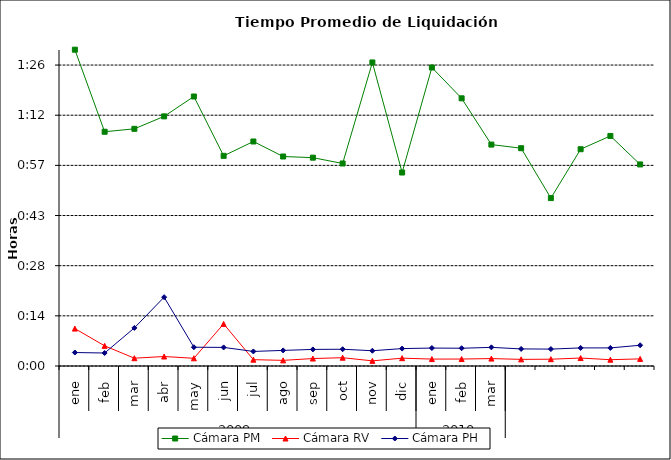
| Category | Cámara PM | Cámara RV | Cámara PH |
|---|---|---|---|
| 0 | 0.063 | 0.007 | 0.003 |
| 1 | 0.047 | 0.004 | 0.003 |
| 2 | 0.047 | 0.002 | 0.008 |
| 3 | 0.05 | 0.002 | 0.014 |
| 4 | 0.054 | 0.002 | 0.004 |
| 5 | 0.042 | 0.008 | 0.004 |
| 6 | 0.045 | 0.001 | 0.003 |
| 7 | 0.042 | 0.001 | 0.003 |
| 8 | 0.042 | 0.001 | 0.003 |
| 9 | 0.04 | 0.002 | 0.003 |
| 10 | 0.061 | 0.001 | 0.003 |
| 11 | 0.039 | 0.002 | 0.003 |
| 12 | 0.06 | 0.001 | 0.004 |
| 13 | 0.053 | 0.001 | 0.004 |
| 14 | 0.044 | 0.001 | 0.004 |
| 15 | 0.043 | 0.001 | 0.003 |
| 16 | 0.033 | 0.001 | 0.003 |
| 17 | 0.043 | 0.002 | 0.004 |
| 18 | 0.046 | 0.001 | 0.004 |
| 19 | 0.04 | 0.001 | 0.004 |